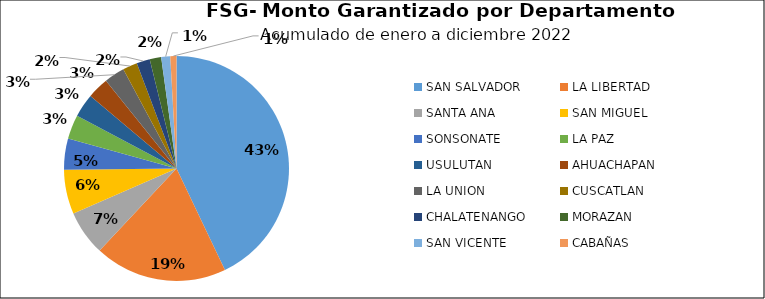
| Category | Monto | Créditos |
|---|---|---|
| SAN SALVADOR | 30.508 | 4038 |
| LA LIBERTAD | 13.549 | 1839 |
| SANTA ANA | 4.61 | 907 |
| SAN MIGUEL | 4.518 | 742 |
| SONSONATE | 3.177 | 636 |
| LA PAZ | 2.466 | 766 |
| USULUTAN | 2.405 | 657 |
| AHUACHAPAN | 2.186 | 607 |
| LA UNION | 2.099 | 470 |
| CUSCATLAN | 1.492 | 458 |
| CHALATENANGO | 1.355 | 296 |
| MORAZAN | 1.17 | 348 |
| SAN VICENTE | 0.923 | 315 |
| CABAÑAS | 0.629 | 248 |